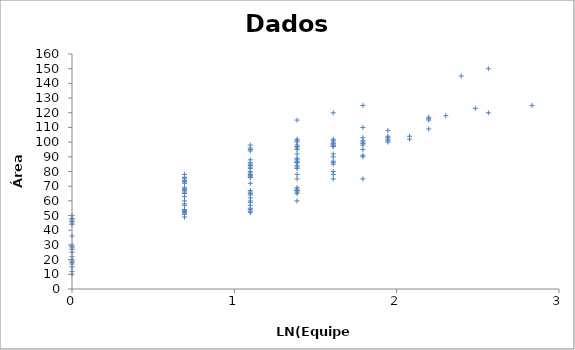
| Category | Series 0 |
|---|---|
| 0.0 | 10 |
| 0.0 | 12 |
| 0.0 | 15 |
| 0.0 | 17 |
| 0.0 | 18 |
| 0.0 | 19 |
| 0.0 | 20 |
| 0.0 | 22 |
| 0.0 | 25 |
| 0.0 | 27 |
| 0.0 | 28 |
| 0.0 | 29 |
| 0.0 | 30 |
| 0.0 | 36 |
| 0.0 | 44 |
| 0.0 | 45 |
| 0.0 | 46 |
| 0.0 | 47 |
| 0.0 | 48 |
| 0.0 | 48 |
| 0.0 | 50 |
| 0.6931471805599453 | 49 |
| 0.6931471805599453 | 51 |
| 0.6931471805599453 | 51 |
| 0.6931471805599453 | 52 |
| 0.6931471805599453 | 53 |
| 0.6931471805599453 | 53 |
| 0.6931471805599453 | 53 |
| 0.6931471805599453 | 54 |
| 0.6931471805599453 | 54 |
| 0.6931471805599453 | 57 |
| 0.6931471805599453 | 58 |
| 0.6931471805599453 | 60 |
| 0.6931471805599453 | 63 |
| 0.6931471805599453 | 65 |
| 0.6931471805599453 | 66 |
| 0.6931471805599453 | 67 |
| 0.6931471805599453 | 68 |
| 0.6931471805599453 | 68 |
| 0.6931471805599453 | 69 |
| 0.6931471805599453 | 72 |
| 0.6931471805599453 | 73 |
| 0.6931471805599453 | 73 |
| 0.6931471805599453 | 74 |
| 0.6931471805599453 | 75 |
| 0.6931471805599453 | 76 |
| 0.6931471805599453 | 76 |
| 0.6931471805599453 | 78 |
| 1.0986122886681098 | 52 |
| 1.0986122886681098 | 53 |
| 1.0986122886681098 | 54 |
| 1.0986122886681098 | 55 |
| 1.0986122886681098 | 57 |
| 1.0986122886681098 | 59 |
| 1.0986122886681098 | 60 |
| 1.0986122886681098 | 62 |
| 1.0986122886681098 | 64 |
| 1.0986122886681098 | 65 |
| 1.0986122886681098 | 66 |
| 1.0986122886681098 | 67 |
| 1.0986122886681098 | 72 |
| 1.0986122886681098 | 76 |
| 1.0986122886681098 | 76 |
| 1.0986122886681098 | 77 |
| 1.0986122886681098 | 77 |
| 1.0986122886681098 | 78 |
| 1.0986122886681098 | 79 |
| 1.0986122886681098 | 80 |
| 1.0986122886681098 | 82 |
| 1.0986122886681098 | 83 |
| 1.0986122886681098 | 84 |
| 1.0986122886681098 | 85 |
| 1.0986122886681098 | 86 |
| 1.0986122886681098 | 88 |
| 1.0986122886681098 | 94 |
| 1.0986122886681098 | 95 |
| 1.0986122886681098 | 96 |
| 1.0986122886681098 | 98 |
| 1.3862943611198906 | 60 |
| 1.3862943611198906 | 65 |
| 1.3862943611198906 | 66 |
| 1.3862943611198906 | 67 |
| 1.3862943611198906 | 67 |
| 1.3862943611198906 | 68 |
| 1.3862943611198906 | 69 |
| 1.3862943611198906 | 75 |
| 1.3862943611198906 | 78 |
| 1.3862943611198906 | 82 |
| 1.3862943611198906 | 83 |
| 1.3862943611198906 | 84 |
| 1.3862943611198906 | 86 |
| 1.3862943611198906 | 86 |
| 1.3862943611198906 | 87 |
| 1.3862943611198906 | 88 |
| 1.3862943611198906 | 89 |
| 1.3862943611198906 | 92 |
| 1.3862943611198906 | 95 |
| 1.3862943611198906 | 96 |
| 1.3862943611198906 | 97 |
| 1.3862943611198906 | 98 |
| 1.3862943611198906 | 100 |
| 1.3862943611198906 | 101 |
| 1.3862943611198906 | 102 |
| 1.3862943611198906 | 115 |
| 1.6094379124341003 | 75 |
| 1.6094379124341003 | 78 |
| 1.6094379124341003 | 80 |
| 1.6094379124341003 | 85 |
| 1.6094379124341003 | 86 |
| 1.6094379124341003 | 87 |
| 1.6094379124341003 | 90 |
| 1.6094379124341003 | 92 |
| 1.6094379124341003 | 97 |
| 1.6094379124341003 | 97 |
| 1.6094379124341003 | 98 |
| 1.6094379124341003 | 98 |
| 1.6094379124341003 | 99 |
| 1.6094379124341003 | 100 |
| 1.6094379124341003 | 101 |
| 1.6094379124341003 | 102 |
| 1.6094379124341003 | 120 |
| 1.791759469228055 | 75 |
| 1.791759469228055 | 90 |
| 1.791759469228055 | 91 |
| 1.791759469228055 | 95 |
| 1.791759469228055 | 98 |
| 1.791759469228055 | 99 |
| 1.791759469228055 | 100 |
| 1.791759469228055 | 101 |
| 1.791759469228055 | 103 |
| 1.791759469228055 | 110 |
| 1.791759469228055 | 125 |
| 1.9459101490553132 | 100 |
| 1.9459101490553132 | 101 |
| 1.9459101490553132 | 102 |
| 1.9459101490553132 | 103 |
| 1.9459101490553132 | 104 |
| 1.9459101490553132 | 108 |
| 2.0794415416798357 | 102 |
| 2.0794415416798357 | 104 |
| 2.1972245773362196 | 109 |
| 2.1972245773362196 | 115 |
| 2.1972245773362196 | 116 |
| 2.1972245773362196 | 117 |
| 2.302585092994046 | 118 |
| 2.3978952727983707 | 145 |
| 2.4849066497880004 | 123 |
| 2.5649493574615367 | 120 |
| 2.5649493574615367 | 150 |
| 2.833213344056216 | 125 |